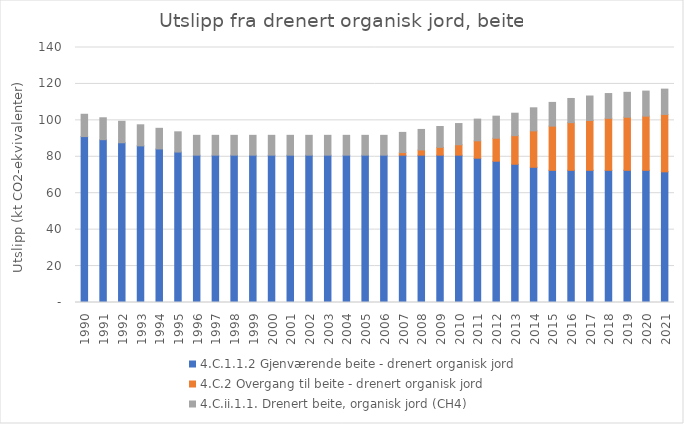
| Category | 4.C.1.1.2 Gjenværende beite - drenert organisk jord | 4.C.2 Overgang til beite - drenert organisk jord | 4.C.ii.1.1. Drenert beite, organisk jord (CH4) |
|---|---|---|---|
| 1990.0 | 91.092 | 0 | 12.251 |
| 1991.0 | 89.393 | 0 | 12.022 |
| 1992.0 | 87.693 | 0 | 11.793 |
| 1993.0 | 85.994 | 0 | 11.565 |
| 1994.0 | 84.294 | 0 | 11.336 |
| 1995.0 | 82.595 | 0 | 11.108 |
| 1996.0 | 80.895 | 0 | 10.879 |
| 1997.0 | 80.895 | 0 | 10.879 |
| 1998.0 | 80.895 | 0 | 10.879 |
| 1999.0 | 80.895 | 0 | 10.879 |
| 2000.0 | 80.895 | 0 | 10.879 |
| 2001.0 | 80.895 | 0 | 10.879 |
| 2002.0 | 80.895 | 0 | 10.879 |
| 2003.0 | 80.895 | 0 | 10.879 |
| 2004.0 | 80.895 | 0 | 10.879 |
| 2005.0 | 80.895 | 0 | 10.879 |
| 2006.0 | 80.895 | 0 | 10.879 |
| 2007.0 | 80.895 | 1.428 | 11.071 |
| 2008.0 | 80.895 | 2.855 | 11.263 |
| 2009.0 | 80.895 | 4.283 | 11.455 |
| 2010.0 | 80.895 | 5.71 | 11.647 |
| 2011.0 | 79.23 | 9.517 | 11.935 |
| 2012.0 | 77.564 | 12.61 | 12.127 |
| 2013.0 | 75.899 | 15.703 | 12.319 |
| 2014.0 | 74.233 | 19.986 | 12.671 |
| 2015.0 | 72.568 | 24.269 | 13.023 |
| 2016.0 | 72.568 | 26.172 | 13.279 |
| 2017.0 | 72.568 | 27.362 | 13.439 |
| 2018.0 | 72.568 | 28.551 | 13.599 |
| 2019.0 | 72.568 | 29.146 | 13.679 |
| 2020.0 | 72.568 | 29.741 | 13.759 |
| 2021.0 | 71.735 | 31.525 | 13.887 |